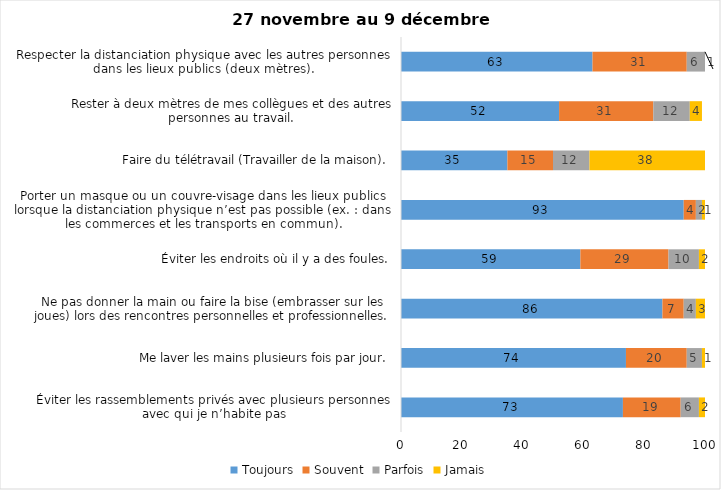
| Category | Toujours | Souvent | Parfois | Jamais |
|---|---|---|---|---|
| Éviter les rassemblements privés avec plusieurs personnes avec qui je n’habite pas | 73 | 19 | 6 | 2 |
| Me laver les mains plusieurs fois par jour. | 74 | 20 | 5 | 1 |
| Ne pas donner la main ou faire la bise (embrasser sur les joues) lors des rencontres personnelles et professionnelles. | 86 | 7 | 4 | 3 |
| Éviter les endroits où il y a des foules. | 59 | 29 | 10 | 2 |
| Porter un masque ou un couvre-visage dans les lieux publics lorsque la distanciation physique n’est pas possible (ex. : dans les commerces et les transports en commun). | 93 | 4 | 2 | 1 |
| Faire du télétravail (Travailler de la maison). | 35 | 15 | 12 | 38 |
| Rester à deux mètres de mes collègues et des autres personnes au travail. | 52 | 31 | 12 | 4 |
| Respecter la distanciation physique avec les autres personnes dans les lieux publics (deux mètres). | 63 | 31 | 6 | 1 |